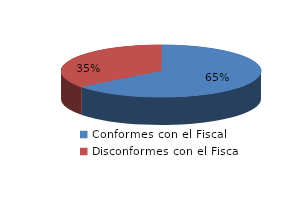
| Category | Series 0 |
|---|---|
| 0 | 395 |
| 1 | 217 |